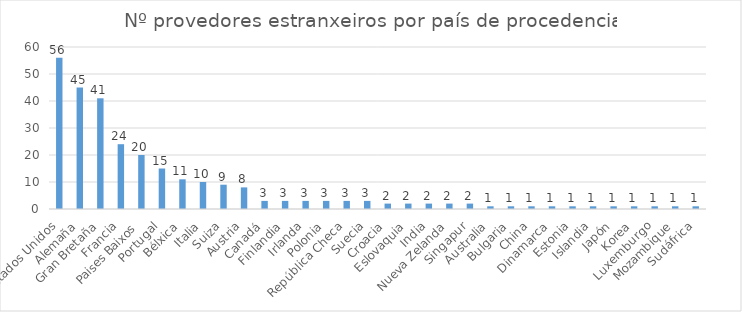
| Category | Series 0 |
|---|---|
| Estados Unidos | 56 |
| Alemaña | 45 |
| Gran Bretaña | 41 |
| Francia | 24 |
| Paises Baixos | 20 |
| Portugal | 15 |
| Bélxica | 11 |
| Italia | 10 |
| Suiza | 9 |
| Austria | 8 |
| Canadá | 3 |
| Finlandia | 3 |
| Irlanda | 3 |
| Polonia | 3 |
| República Checa | 3 |
| Suecia | 3 |
| Croacia | 2 |
| Eslovaquia | 2 |
| India | 2 |
| Nueva Zelanda | 2 |
| Singapur | 2 |
| Australia | 1 |
| Bulgaria | 1 |
| China | 1 |
| Dinamarca | 1 |
| Estonia | 1 |
| Islandia | 1 |
| Japón | 1 |
| Korea | 1 |
| Luxemburgo | 1 |
| Mozambique | 1 |
| Sudáfrica | 1 |